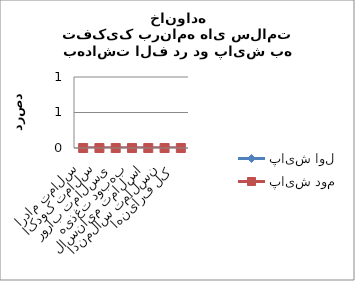
| Category | پایش اول | پایش دوم |
|---|---|---|
| سلامت مادران | 0 | 0 |
| سلامت کودکان | 0 | 0 |
| سلامت باروری | 0 | 0 |
| بهبود تغذیه | 0 | 0 |
| سلامت میانسالان | 0 | 0 |
| سلامت سالمندان | 0 | 0 |
| کل فرآینها | 0 | 0 |